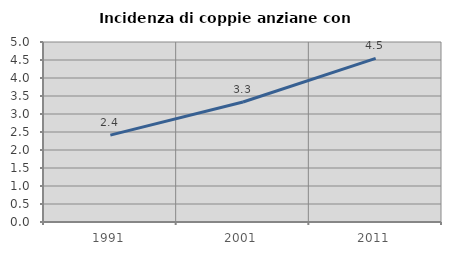
| Category | Incidenza di coppie anziane con figli |
|---|---|
| 1991.0 | 2.414 |
| 2001.0 | 3.332 |
| 2011.0 | 4.546 |